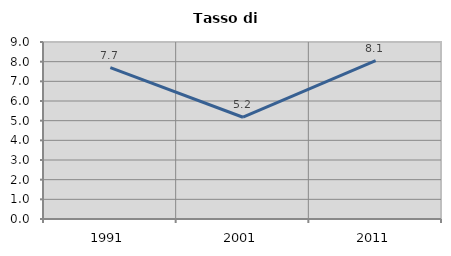
| Category | Tasso di disoccupazione   |
|---|---|
| 1991.0 | 7.692 |
| 2001.0 | 5.175 |
| 2011.0 | 8.051 |